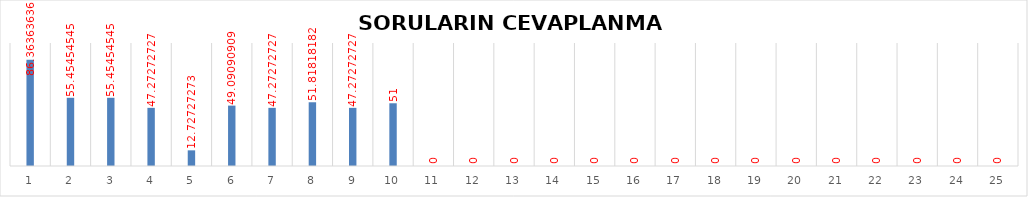
| Category | Series 0 |
|---|---|
| 0 | 86.364 |
| 1 | 55.455 |
| 2 | 55.455 |
| 3 | 47.273 |
| 4 | 12.727 |
| 5 | 49.091 |
| 6 | 47.273 |
| 7 | 51.818 |
| 8 | 47.273 |
| 9 | 51 |
| 10 | 0 |
| 11 | 0 |
| 12 | 0 |
| 13 | 0 |
| 14 | 0 |
| 15 | 0 |
| 16 | 0 |
| 17 | 0 |
| 18 | 0 |
| 19 | 0 |
| 20 | 0 |
| 21 | 0 |
| 22 | 0 |
| 23 | 0 |
| 24 | 0 |